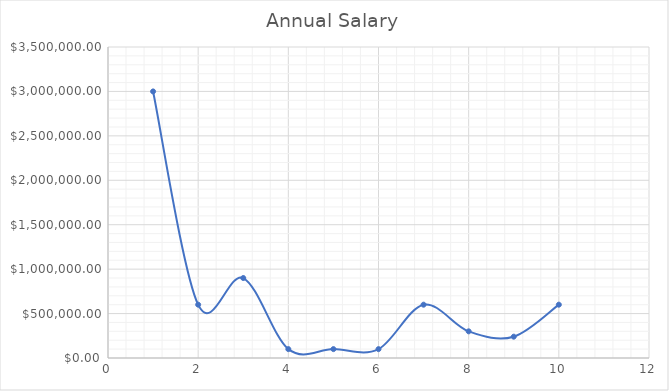
| Category | Annual Salary |
|---|---|
| 0 | 3000000 |
| 1 | 600000 |
| 2 | 900000 |
| 3 | 100000 |
| 4 | 100000 |
| 5 | 100000 |
| 6 | 600000 |
| 7 | 300000 |
| 8 | 240000 |
| 9 | 600000 |